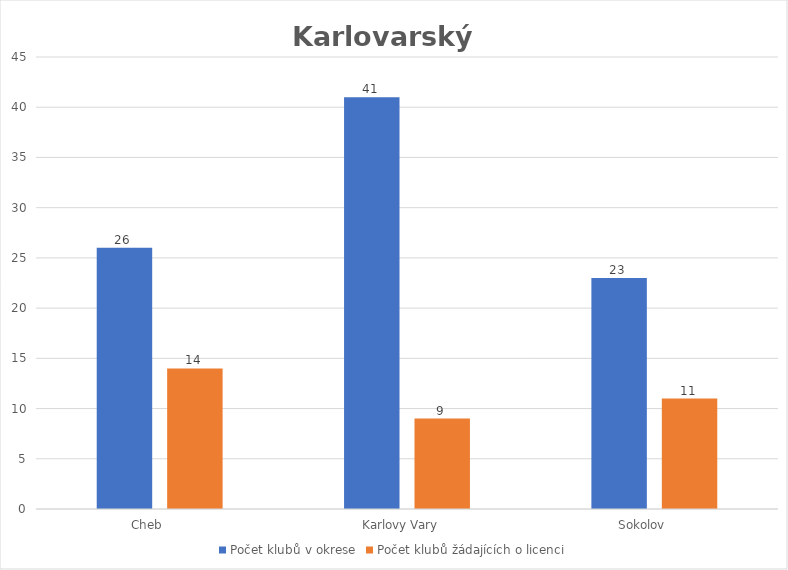
| Category | Počet klubů v okrese | Počet klubů žádajících o licenci |
|---|---|---|
| Cheb       | 26 | 14 |
| Karlovy Vary   | 41 | 9 |
| Sokolov       | 23 | 11 |